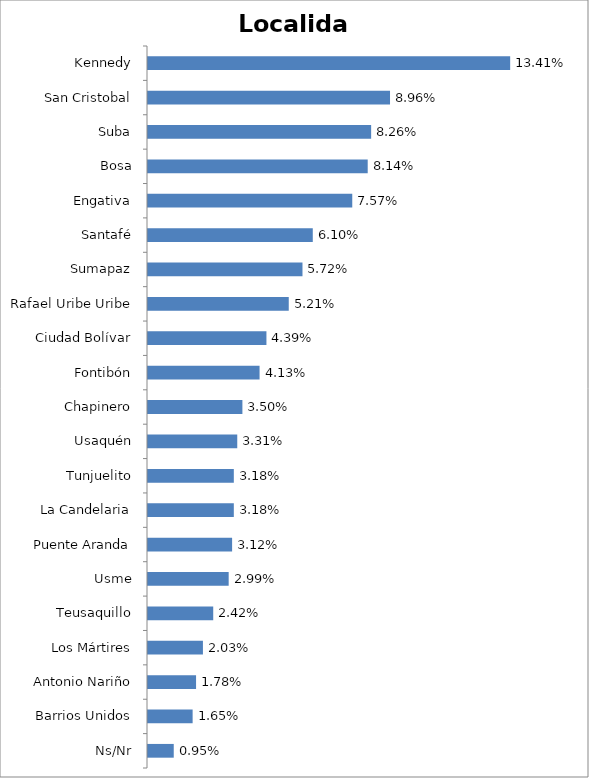
| Category | Total |
|---|---|
| Ns/Nr | 0.01 |
| Barrios Unidos | 0.017 |
| Antonio Nariño | 0.018 |
| Los Mártires | 0.02 |
| Teusaquillo | 0.024 |
| Usme | 0.03 |
| Puente Aranda | 0.031 |
| La Candelaria | 0.032 |
| Tunjuelito | 0.032 |
| Usaquén | 0.033 |
| Chapinero | 0.035 |
| Fontibón | 0.041 |
| Ciudad Bolívar | 0.044 |
| Rafael Uribe Uribe | 0.052 |
| Sumapaz | 0.057 |
| Santafé | 0.061 |
| Engativa | 0.076 |
| Bosa | 0.081 |
| Suba | 0.083 |
| San Cristobal | 0.09 |
| Kennedy | 0.134 |